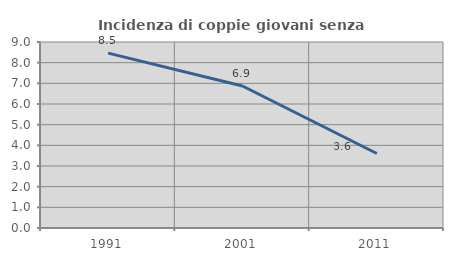
| Category | Incidenza di coppie giovani senza figli |
|---|---|
| 1991.0 | 8.463 |
| 2001.0 | 6.872 |
| 2011.0 | 3.604 |